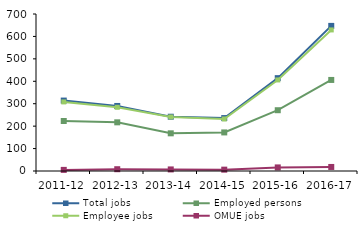
| Category | Total jobs | Employed persons | Employee jobs | OMUE jobs |
|---|---|---|---|---|
| 2011-12 | 314 | 223 | 308 | 5 |
| 2012-13 | 290 | 217 | 284 | 8 |
| 2013-14 | 242 | 168 | 241 | 7 |
| 2014-15 | 236 | 172 | 232 | 6 |
| 2015-16 | 414 | 271 | 406 | 16 |
| 2016-17 | 647 | 406 | 629 | 18 |